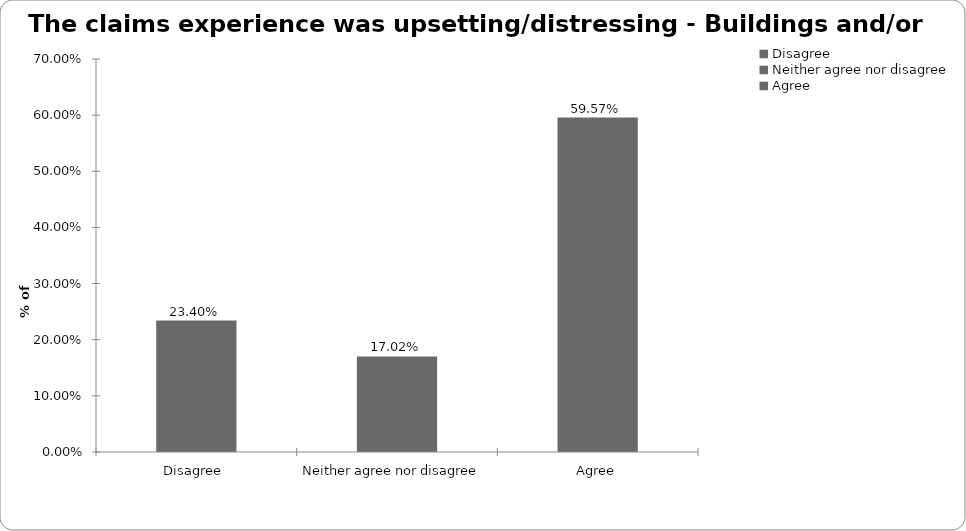
| Category | Buildings and/or conents |
|---|---|
| Disagree  | 0.234 |
| Neither agree nor disagree  | 0.17 |
| Agree | 0.596 |